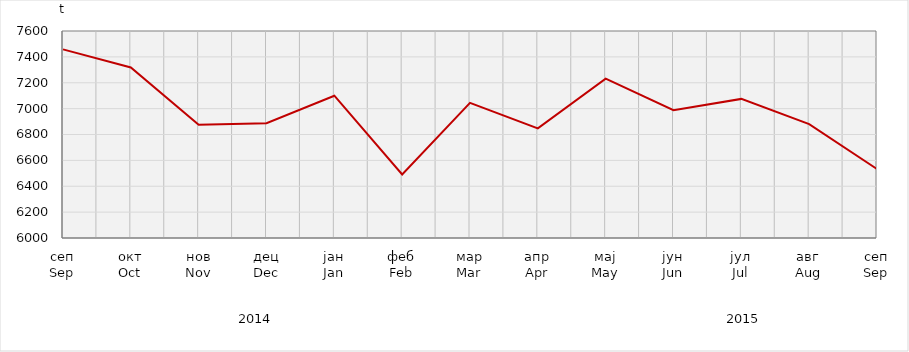
| Category | Series 0 |
|---|---|
| сеп
Sep | 7457.865 |
| окт
Oct | 7318.004 |
| нов
Nov | 6875.135 |
| дец
Dec | 6887.315 |
| јан
Jan | 7099.8 |
| феб
Feb | 6490.829 |
| мар
Mar | 7044.938 |
| апр
Apr | 6847.171 |
| мај
May | 7231.754 |
| јун
Jun | 6987.984 |
| јул
Jul | 7075.246 |
| авг
Aug | 6880.441 |
| сеп
Sep | 6532.974 |